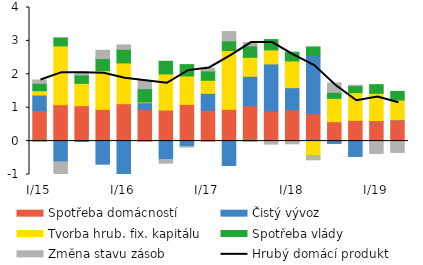
| Category | Spotřeba domácností | Čistý vývoz | Tvorba hrub. fix. kapitálu | Spotřeba vlády | Změna stavu zásob |
|---|---|---|---|---|---|
| I/15 | 0.91 | 0.47 | 0.13 | 0.22 | 0.1 |
| II | 1.09 | -0.62 | 1.76 | 0.24 | -0.42 |
| III | 1.06 | -0.01 | 0.67 | 0.25 | 0.08 |
| IV | 0.95 | -0.69 | 1.16 | 0.36 | 0.25 |
| I/16 | 1.12 | -1 | 1.22 | 0.41 | 0.13 |
| II | 0.95 | 0.2 | 0.02 | 0.4 | 0.24 |
| III | 0.93 | -0.55 | 1.08 | 0.38 | -0.11 |
| IV | 1.1 | -0.16 | 0.85 | 0.34 | -0.02 |
| I/17 | 0.92 | 0.51 | 0.39 | 0.28 | 0.09 |
| II | 0.95 | -0.73 | 1.76 | 0.29 | 0.28 |
| III | 1.06 | 0.88 | 0.57 | 0.34 | 0.1 |
| IV | 0.9 | 1.41 | 0.42 | 0.31 | -0.09 |
| I/18 | 0.94 | 0.66 | 0.8 | 0.26 | -0.08 |
| II | 0.82 | 1.74 | -0.43 | 0.26 | -0.13 |
| III | 0.58 | -0.07 | 0.7 | 0.18 | 0.28 |
| IV | 0.62 | -0.46 | 0.83 | 0.21 | 0.01 |
| I/19 | 0.59 | 0.02 | 0.82 | 0.26 | -0.37 |
| II | 0.63 | 0.01 | 0.59 | 0.26 | -0.34 |